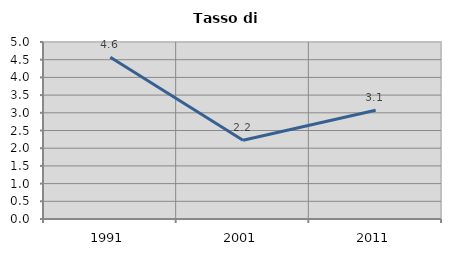
| Category | Tasso di disoccupazione   |
|---|---|
| 1991.0 | 4.567 |
| 2001.0 | 2.226 |
| 2011.0 | 3.074 |